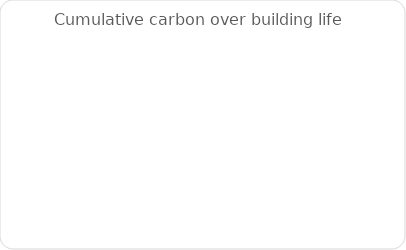
| Category | Series 0 |
|---|---|
| Commute/year | 0 |
| Energy/year | 0 |
| Building Materials  | 0 |